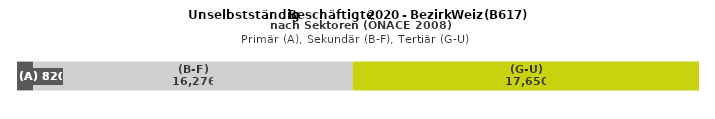
| Category | (A) | (B-F) | (G-U) |
|---|---|---|---|
| 0 | 820 | 16276 | 17650 |